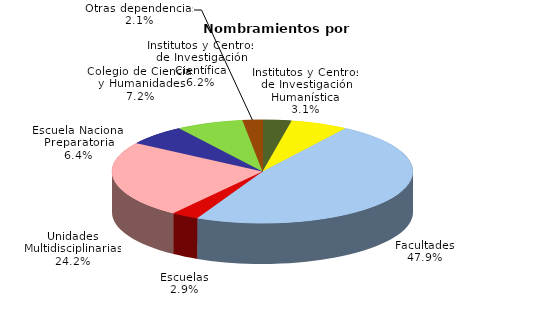
| Category | Series 0 |
|---|---|
| Institutos y Centros de Investigación Humanística | 1557 |
| Institutos y Centros de Investigación Científica | 3108 |
| Facultades | 24157 |
| Escuelas | 1486 |
| Unidades Multidisciplinarias | 12224 |
| Escuela Nacional Preparatoria | 3236 |
| Colegio de Ciencias y Humanidades | 3628 |
| Otras dependencias | 1072 |